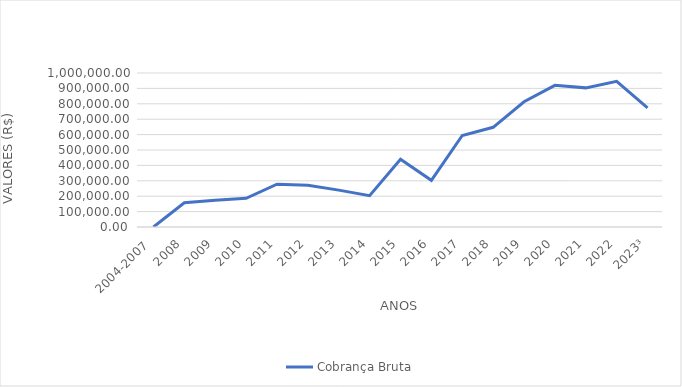
| Category | Cobrança Bruta  |
|---|---|
| 2004-2007  | 0 |
| 2008 | 157605.54 |
| 2009 | 174057.23 |
| 2010 | 186221.83 |
| 2011 | 277926.28 |
| 2012 | 270401.86 |
| 2013 | 239428.34 |
| 2014 | 203684.96 |
| 2015 | 440518.8 |
| 2016 | 303091.24 |
| 2017 | 594167.27 |
| 2018 | 647275.63 |
| 2019 | 813243.96 |
| 2020 | 919909.83 |
| 2021 | 903479.54 |
| 2022 | 945842.63 |
| 2023³ | 774254.66 |